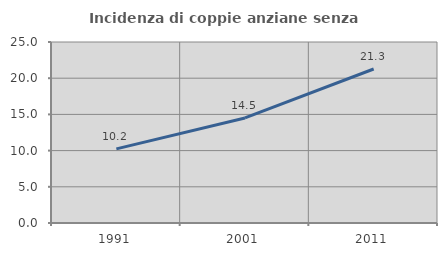
| Category | Incidenza di coppie anziane senza figli  |
|---|---|
| 1991.0 | 10.241 |
| 2001.0 | 14.508 |
| 2011.0 | 21.272 |